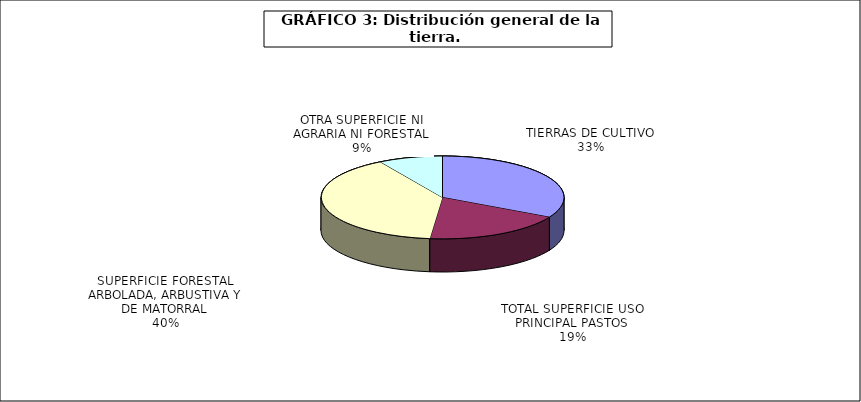
| Category | Series 0 |
|---|---|
| TIERRAS DE CULTIVO | 16646395.13 |
| TOTAL SUPERFICIE USO PRINCIPAL PASTOS | 9496243 |
| SUPERFICIE FORESTAL ARBOLADA, ARBUSTIVA Y DE MATORRAL | 20122834 |
| OTRA SUPERFICIE NI AGRARIA NI FORESTAL | 4331517 |